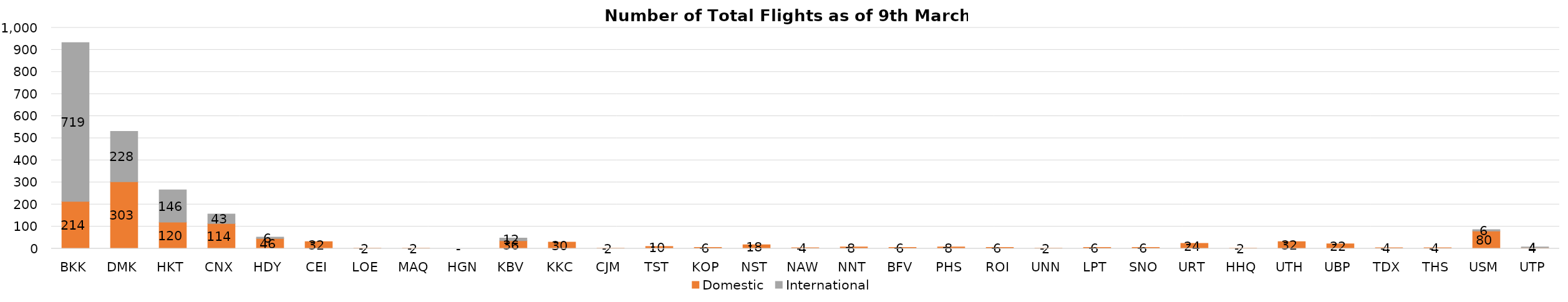
| Category | Domestic | International |
|---|---|---|
| BKK | 214 | 719 |
| DMK | 303 | 228 |
| HKT | 120 | 146 |
| CNX | 114 | 43 |
| HDY | 46 | 6 |
| CEI | 32 | 0 |
| LOE | 2 | 0 |
| MAQ | 2 | 0 |
| HGN | 0 | 0 |
| KBV | 36 | 12 |
| KKC | 30 | 0 |
| CJM | 2 | 0 |
| TST | 10 | 0 |
| KOP | 6 | 0 |
| NST | 18 | 0 |
| NAW | 4 | 0 |
| NNT | 8 | 0 |
| BFV | 6 | 0 |
| PHS | 8 | 0 |
| ROI | 6 | 0 |
| UNN | 2 | 0 |
| LPT | 6 | 0 |
| SNO | 6 | 0 |
| URT | 24 | 0 |
| HHQ | 2 | 0 |
| UTH | 32 | 0 |
| UBP | 22 | 0 |
| TDX | 4 | 0 |
| THS | 4 | 0 |
| USM | 80 | 6 |
| UTP | 4 | 4 |